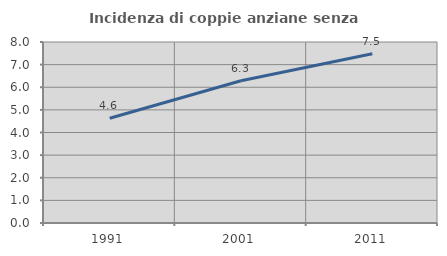
| Category | Incidenza di coppie anziane senza figli  |
|---|---|
| 1991.0 | 4.63 |
| 2001.0 | 6.289 |
| 2011.0 | 7.483 |